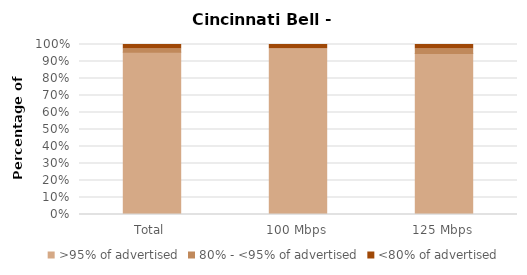
| Category | >95% of advertised | 80% - <95% of advertised | <80% of advertised |
|---|---|---|---|
| Total | 0.954 | 0.02 | 0.026 |
| 100 Mbps | 0.975 | 0 | 0.025 |
| 125 Mbps | 0.947 | 0.027 | 0.027 |